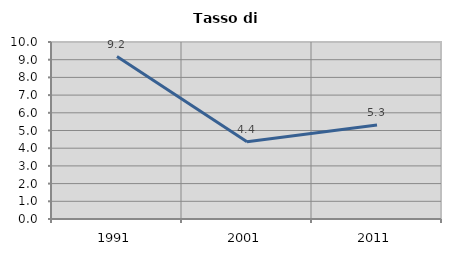
| Category | Tasso di disoccupazione   |
|---|---|
| 1991.0 | 9.176 |
| 2001.0 | 4.37 |
| 2011.0 | 5.31 |